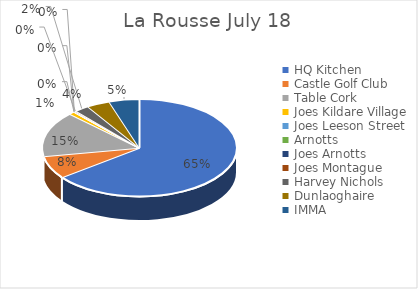
| Category | Series 0 |
|---|---|
| HQ Kitchen | 0.646 |
| Castle Golf Club | 0.076 |
| Table Cork | 0.151 |
| Joes Kildare Village | 0.01 |
| Joes Leeson Street | 0 |
| Arnotts | 0 |
| Joes Arnotts | 0.002 |
| Joes Montague | 0.003 |
| Harvey Nichols | 0.024 |
| Dunlaoghaire | 0.038 |
| IMMA | 0.05 |